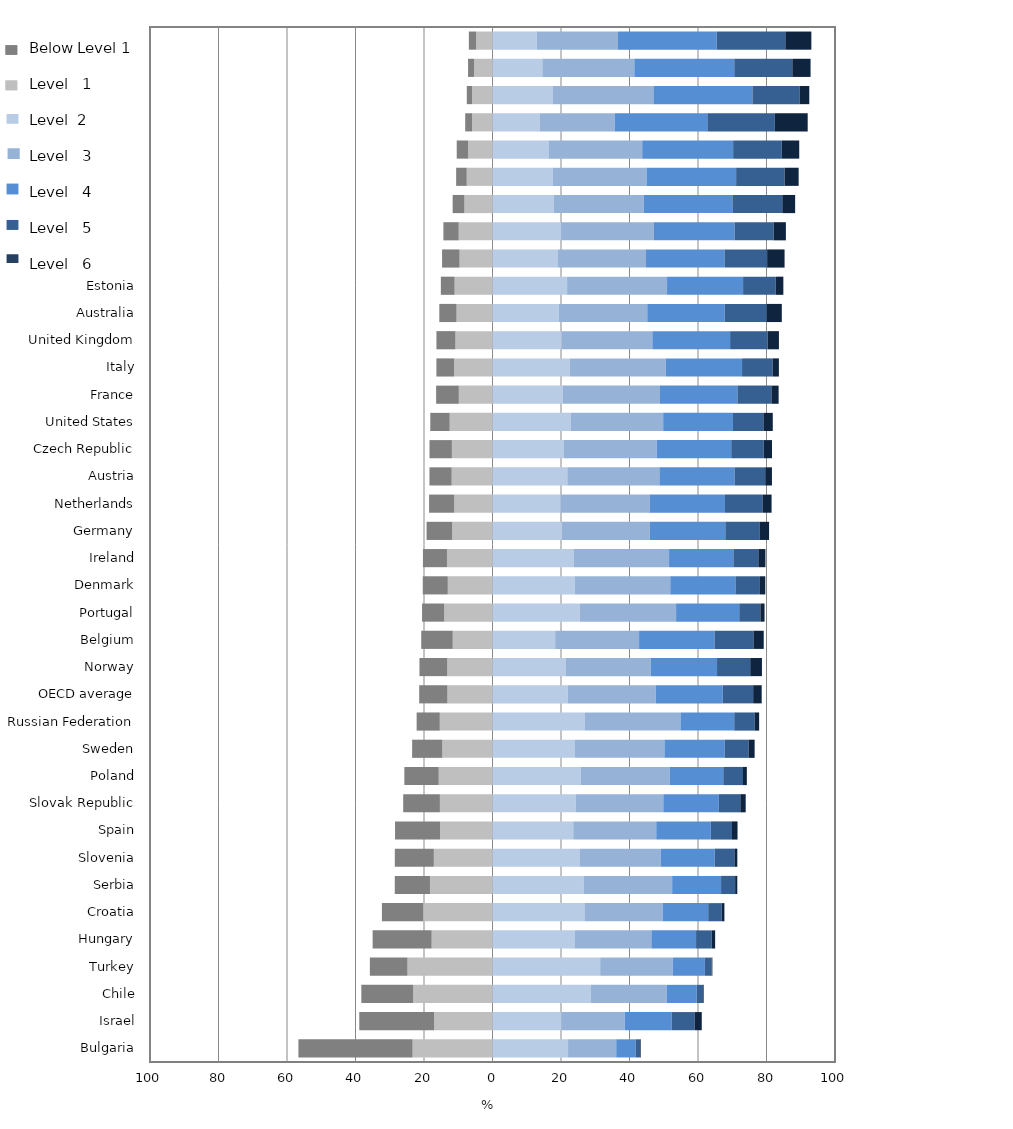
| Category | Level 1 | Below Level 1 | Level 2 | Level 3
 | Level 4
 | Level 5
 | Level 6
 |
|---|---|---|---|---|---|---|---|
| Korea | -4.764 | -2.141 | 12.923 | 23.711 | 28.832 | 20.034 | 7.595 |
| Japan | -5.344 | -1.791 | 14.557 | 26.857 | 29.18 | 16.943 | 5.327 |
| Macao-China | -5.954 | -1.553 | 17.529 | 29.468 | 28.892 | 13.83 | 2.774 |
| Singapore | -5.956 | -2.015 | 13.78 | 21.925 | 27.032 | 19.697 | 9.596 |
| Hong Kong-China | -7.11 | -3.334 | 16.347 | 27.37 | 26.546 | 14.184 | 5.11 |
| Shanghai-China | -7.526 | -3.09 | 17.528 | 27.439 | 26.161 | 14.149 | 4.106 |
| Chinese Taipei | -8.195 | -3.441 | 17.829 | 26.296 | 25.926 | 14.558 | 3.756 |
| Finland | -9.874 | -4.465 | 20.02 | 27.104 | 23.535 | 11.4 | 3.602 |
| Canada | -9.619 | -5.103 | 18.981 | 25.843 | 22.92 | 12.438 | 5.096 |
| Estonia | -11.07 | -4.011 | 21.783 | 29.18 | 22.199 | 9.546 | 2.211 |
| Australia | -10.502 | -5.029 | 19.38 | 25.808 | 22.584 | 12.273 | 4.423 |
| United Kingdom | -10.821 | -5.548 | 20.168 | 26.505 | 22.703 | 10.93 | 3.325 |
| Italy | -11.202 | -5.177 | 22.532 | 28.035 | 22.295 | 8.923 | 1.836 |
| France | -9.834 | -6.625 | 20.459 | 28.444 | 22.607 | 9.928 | 2.103 |
| United States | -12.503 | -5.662 | 22.791 | 27.045 | 20.373 | 8.888 | 2.737 |
| Czech Republic | -11.86 | -6.533 | 20.72 | 27.216 | 21.768 | 9.474 | 2.429 |
| Austria | -11.924 | -6.486 | 21.842 | 26.895 | 21.914 | 8.972 | 1.966 |
| Netherlands | -11.158 | -7.358 | 19.889 | 25.972 | 22.015 | 10.947 | 2.661 |
| Germany | -11.768 | -7.48 | 20.296 | 25.642 | 22.035 | 10.098 | 2.681 |
| Ireland | -13.294 | -7.015 | 23.754 | 27.802 | 18.769 | 7.298 | 2.067 |
| Denmark | -13.051 | -7.305 | 24.065 | 27.84 | 19.025 | 7.156 | 1.558 |
| Portugal | -14.087 | -6.481 | 25.461 | 28.141 | 18.442 | 6.166 | 1.223 |
| Belgium | -11.607 | -9.203 | 18.304 | 24.495 | 22.014 | 11.375 | 3.001 |
| Norway | -13.204 | -8.124 | 21.463 | 24.693 | 19.402 | 9.692 | 3.422 |
| OECD average | -13.158 | -8.245 | 22.015 | 25.619 | 19.595 | 8.88 | 2.489 |
| Russian Federation | -15.393 | -6.755 | 26.989 | 27.898 | 15.69 | 5.917 | 1.358 |
| Sweden | -14.647 | -8.818 | 23.946 | 26.257 | 17.553 | 6.995 | 1.783 |
| Poland | -15.7 | -10.039 | 25.734 | 25.994 | 15.652 | 5.76 | 1.121 |
| Slovak Republic | -15.358 | -10.716 | 24.268 | 25.609 | 16.218 | 6.261 | 1.57 |
| Spain | -15.315 | -13.142 | 23.578 | 24.233 | 15.935 | 6.183 | 1.615 |
| Slovenia | -17.128 | -11.394 | 25.393 | 23.691 | 15.761 | 5.78 | 0.853 |
| Serbia | -18.258 | -10.271 | 26.69 | 25.765 | 14.277 | 4.111 | 0.627 |
| Croatia | -20.237 | -12.048 | 26.846 | 22.906 | 13.234 | 3.962 | 0.766 |
| Hungary | -17.769 | -17.225 | 23.949 | 22.439 | 13.043 | 4.585 | 0.99 |
| Turkey | -24.82 | -10.983 | 31.438 | 21.171 | 9.404 | 1.99 | 0.194 |
| Chile | -23.149 | -15.149 | 28.628 | 22.205 | 8.796 | 1.905 | 0.169 |
| Israel | -17.038 | -21.862 | 20.084 | 18.509 | 13.686 | 6.698 | 2.123 |
| Bulgaria | -23.332 | -33.335 | 22.053 | 14.073 | 5.632 | 1.412 | 0.163 |